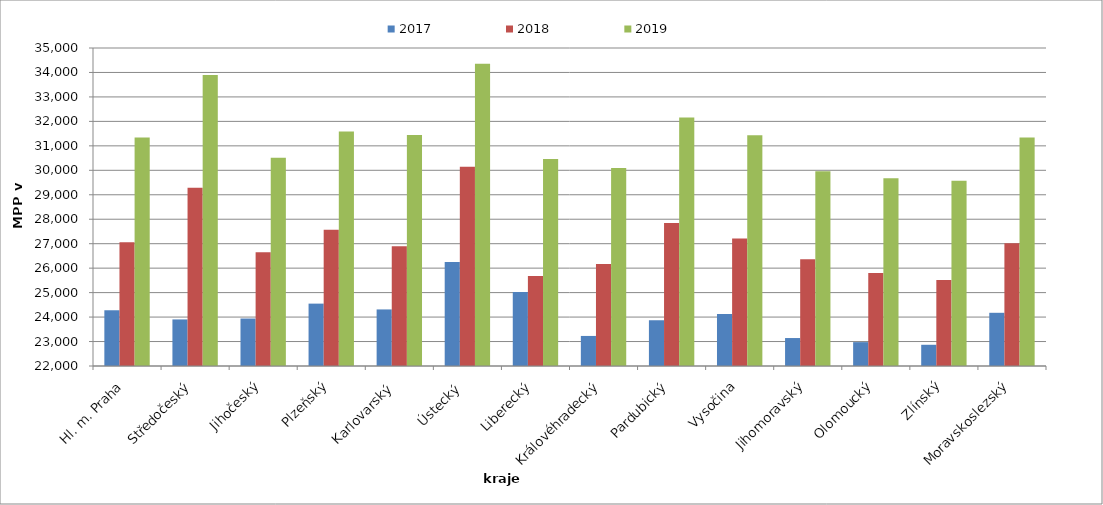
| Category | 2017 | 2018 | 2019 |
|---|---|---|---|
| Hl. m. Praha | 24278.641 | 27055.516 | 31344.457 |
| Středočeský | 23903.813 | 29282.496 | 33900.016 |
| Jihočeský | 23940.674 | 26646.292 | 30509.663 |
| Plzeňský | 24550.117 | 27574.387 | 31588.933 |
| Karlovarský  | 24312.449 | 26899.919 | 31440.195 |
| Ústecký   | 26247.405 | 30140.911 | 34361.142 |
| Liberecký | 25024.905 | 25677.101 | 30461.588 |
| Královéhradecký | 23228.768 | 26169.549 | 30094.568 |
| Pardubický | 23870.283 | 27850.245 | 32154.402 |
| Vysočina | 24124.868 | 27213.397 | 31431.591 |
| Jihomoravský | 23143.116 | 26366.415 | 29959.153 |
| Olomoucký | 22975.632 | 25801.379 | 29671.724 |
| Zlínský | 22867.509 | 25515.146 | 29577.097 |
| Moravskoslezský | 24175.115 | 27023.041 | 31345.622 |